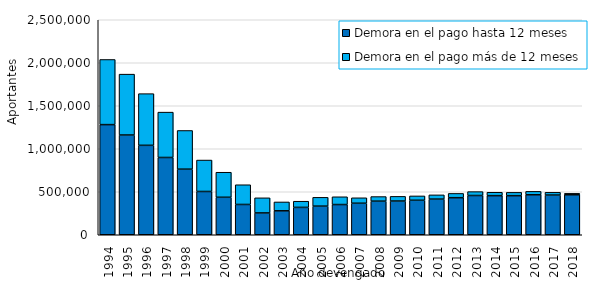
| Category | Demora en el pago hasta 12 meses | Demora en el pago más de 12 meses |
|---|---|---|
| 1994.0 | 1280597 | 757461.167 |
| 1995.0 | 1159708 | 707936.583 |
| 1996.0 | 1039797 | 601095.417 |
| 1997.0 | 898444 | 527560.75 |
| 1998.0 | 762698 | 449861.667 |
| 1999.0 | 503149 | 365630.667 |
| 2000.0 | 435718 | 291302.167 |
| 2001.0 | 352134 | 229352.083 |
| 2002.0 | 253792 | 175570.917 |
| 2003.0 | 278386 | 103140.833 |
| 2004.0 | 318194 | 71824.25 |
| 2005.0 | 332792 | 102436.083 |
| 2006.0 | 351310 | 90245.917 |
| 2007.0 | 366554 | 63189.167 |
| 2008.0 | 390478 | 53656.083 |
| 2009.0 | 391973 | 54388.75 |
| 2010.0 | 401019 | 50482.333 |
| 2011.0 | 414489 | 49340.583 |
| 2012.0 | 430991 | 49739.917 |
| 2013.0 | 456430 | 45301.917 |
| 2014.0 | 454681 | 39597.583 |
| 2015.0 | 454449 | 38638.917 |
| 2016.0 | 464611 | 39946.583 |
| 2017.0 | 461503 | 32064.667 |
| 2018.0 | 464656 | 16818.583 |